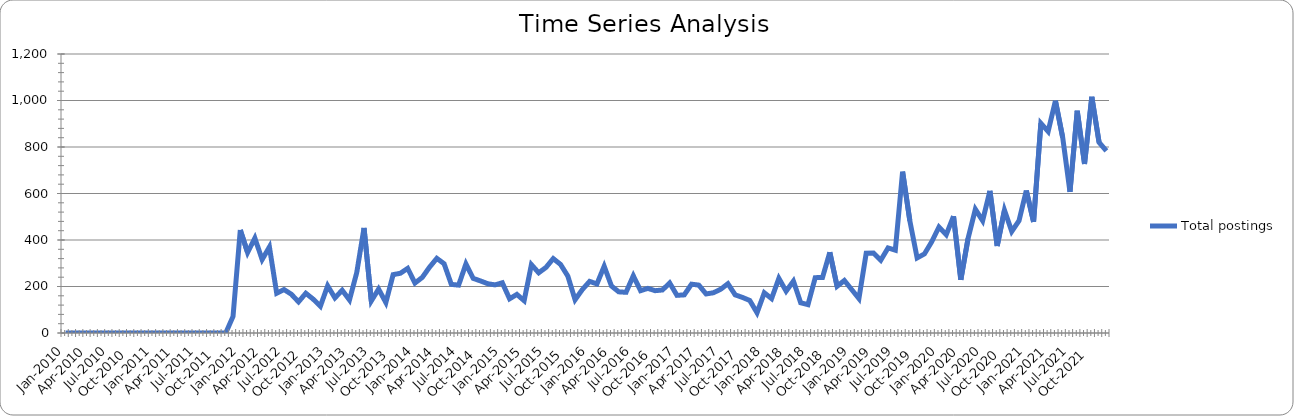
| Category | Total postings |
|---|---|
| Jan-2010 | 0 |
| Feb-2010 | 0 |
| Mar-2010 | 0 |
| Apr-2010 | 0 |
| May-2010 | 0 |
| Jun-2010 | 0 |
| Jul-2010 | 0 |
| Aug-2010 | 0 |
| Sep-2010 | 0 |
| Oct-2010 | 0 |
| Nov-2010 | 0 |
| Dec-2010 | 0 |
| Jan-2011 | 0 |
| Feb-2011 | 0 |
| Mar-2011 | 0 |
| Apr-2011 | 0 |
| May-2011 | 0 |
| Jun-2011 | 0 |
| Jul-2011 | 0 |
| Aug-2011 | 0 |
| Sep-2011 | 0 |
| Oct-2011 | 0 |
| Nov-2011 | 0 |
| Dec-2011 | 71 |
| Jan-2012 | 443 |
| Feb-2012 | 346 |
| Mar-2012 | 408 |
| Apr-2012 | 316 |
| May-2012 | 370 |
| Jun-2012 | 171 |
| Jul-2012 | 187 |
| Aug-2012 | 167 |
| Sep-2012 | 134 |
| Oct-2012 | 171 |
| Nov-2012 | 146 |
| Dec-2012 | 115 |
| Jan-2013 | 203 |
| Feb-2013 | 151 |
| Mar-2013 | 184 |
| Apr-2013 | 142 |
| May-2013 | 260 |
| Jun-2013 | 452 |
| Jul-2013 | 138 |
| Aug-2013 | 189 |
| Sep-2013 | 131 |
| Oct-2013 | 251 |
| Nov-2013 | 257 |
| Dec-2013 | 278 |
| Jan-2014 | 215 |
| Feb-2014 | 239 |
| Mar-2014 | 283 |
| Apr-2014 | 321 |
| May-2014 | 298 |
| Jun-2014 | 209 |
| Jul-2014 | 206 |
| Aug-2014 | 297 |
| Sep-2014 | 235 |
| Oct-2014 | 224 |
| Nov-2014 | 212 |
| Dec-2014 | 207 |
| Jan-2015 | 216 |
| Feb-2015 | 147 |
| Mar-2015 | 166 |
| Apr-2015 | 139 |
| May-2015 | 294 |
| Jun-2015 | 259 |
| Jul-2015 | 282 |
| Aug-2015 | 320 |
| Sep-2015 | 295 |
| Oct-2015 | 245 |
| Nov-2015 | 143 |
| Dec-2015 | 187 |
| Jan-2016 | 222 |
| Feb-2016 | 211 |
| Mar-2016 | 287 |
| Apr-2016 | 202 |
| May-2016 | 177 |
| Jun-2016 | 175 |
| Jul-2016 | 246 |
| Aug-2016 | 182 |
| Sep-2016 | 192 |
| Oct-2016 | 182 |
| Nov-2016 | 185 |
| Dec-2016 | 215 |
| Jan-2017 | 162 |
| Feb-2017 | 164 |
| Mar-2017 | 210 |
| Apr-2017 | 206 |
| May-2017 | 168 |
| Jun-2017 | 173 |
| Jul-2017 | 188 |
| Aug-2017 | 212 |
| Sep-2017 | 164 |
| Oct-2017 | 153 |
| Nov-2017 | 140 |
| Dec-2017 | 87 |
| Jan-2018 | 173 |
| Feb-2018 | 148 |
| Mar-2018 | 235 |
| Apr-2018 | 180 |
| May-2018 | 223 |
| Jun-2018 | 130 |
| Jul-2018 | 122 |
| Aug-2018 | 238 |
| Sep-2018 | 239 |
| Oct-2018 | 347 |
| Nov-2018 | 201 |
| Dec-2018 | 226 |
| Jan-2019 | 187 |
| Feb-2019 | 148 |
| Mar-2019 | 343 |
| Apr-2019 | 344 |
| May-2019 | 313 |
| Jun-2019 | 366 |
| Jul-2019 | 356 |
| Aug-2019 | 694 |
| Sep-2019 | 482 |
| Oct-2019 | 323 |
| Nov-2019 | 340 |
| Dec-2019 | 392 |
| Jan-2020 | 456 |
| Feb-2020 | 423 |
| Mar-2020 | 502 |
| Apr-2020 | 229 |
| May-2020 | 407 |
| Jun-2020 | 532 |
| Jul-2020 | 483 |
| Aug-2020 | 611 |
| Sep-2020 | 374 |
| Oct-2020 | 528 |
| Nov-2020 | 437 |
| Dec-2020 | 483 |
| Jan-2021 | 613 |
| Feb-2021 | 478 |
| Mar-2021 | 902 |
| Apr-2021 | 867 |
| May-2021 | 999 |
| Jun-2021 | 841 |
| Jul-2021 | 607 |
| Aug-2021 | 956 |
| Sep-2021 | 727 |
| Oct-2021 | 1016 |
| Nov-2021 | 820 |
| Dec-2021 | 783 |